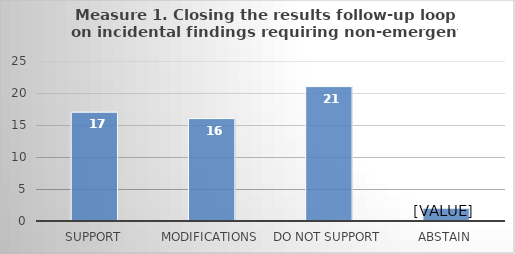
| Category | Series 0 |
|---|---|
| Support | 17 |
| Modifications | 16 |
| Do not support | 21 |
| Abstain | 2 |